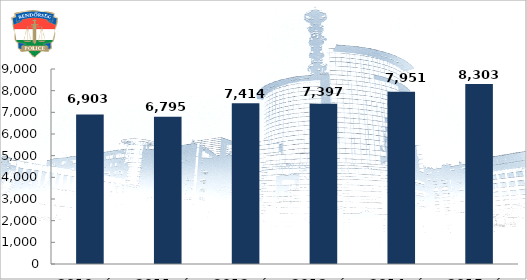
| Category | Közterületi szolgálati létszám (fő) |
|---|---|
| 2010. év | 6903 |
| 2011. év | 6795 |
| 2012. év | 7414 |
| 2013. év | 7397 |
| 2014. év | 7951 |
| 2015. év | 8303 |